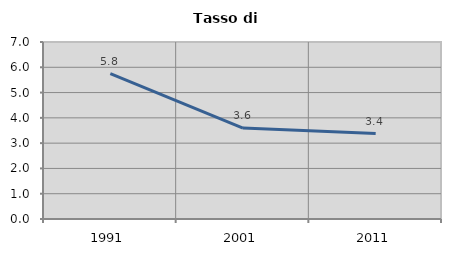
| Category | Tasso di disoccupazione   |
|---|---|
| 1991.0 | 5.753 |
| 2001.0 | 3.597 |
| 2011.0 | 3.378 |